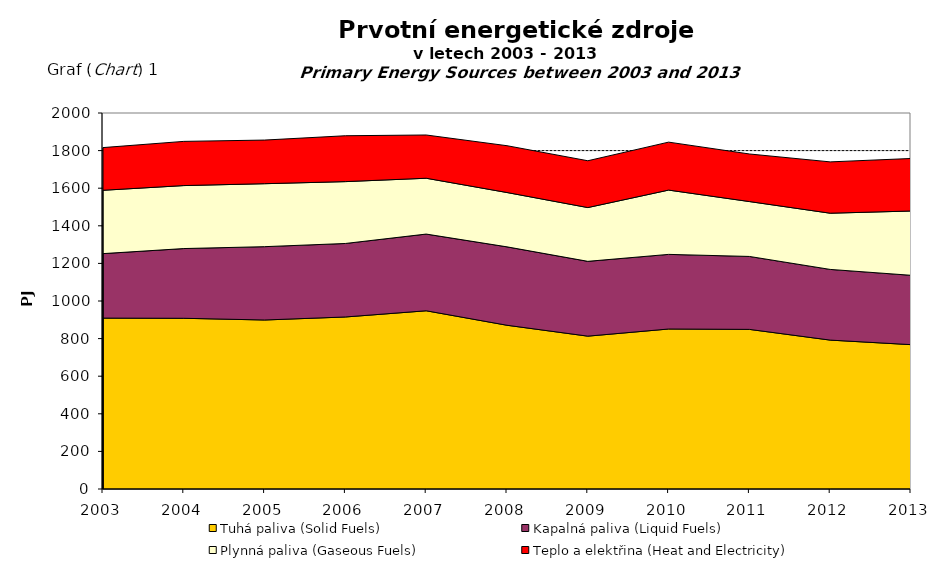
| Category | Tuhá paliva (Solid Fuels) | Kapalná paliva (Liquid Fuels) | Plynná paliva (Gaseous Fuels) | Teplo a elektřina (Heat and Electricity) |
|---|---|---|---|---|
| 2003.0 | 909 | 343 | 337 | 227 |
| 2004.0 | 908 | 371 | 335 | 235 |
| 2005.0 | 899 | 390 | 335 | 232 |
| 2006.0 | 915 | 391 | 329 | 244 |
| 2007.0 | 948 | 408 | 297 | 230 |
| 2008.0 | 871 | 417 | 289 | 249 |
| 2009.0 | 813 | 398 | 286 | 249 |
| 2010.0 | 851 | 397 | 342 | 255 |
| 2011.0 | 849 | 388 | 292 | 253 |
| 2012.0 | 792 | 376 | 299 | 273 |
| 2013.0 | 767.853 | 368.878 | 341.952 | 279.373 |